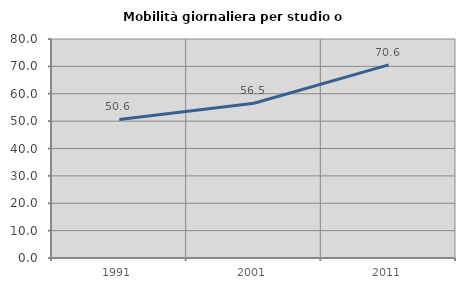
| Category | Mobilità giornaliera per studio o lavoro |
|---|---|
| 1991.0 | 50.614 |
| 2001.0 | 56.55 |
| 2011.0 | 70.561 |